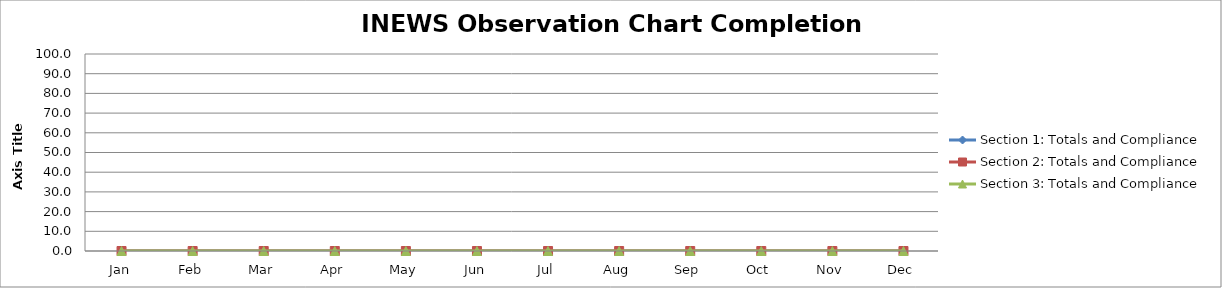
| Category | Section 1: Totals and Compliance | Section 2: Totals and Compliance | Section 3: Totals and Compliance |
|---|---|---|---|
| Jan | 0 | 0 | 0 |
| Feb | 0 | 0 | 0 |
| Mar | 0 | 0 | 0 |
| Apr | 0 | 0 | 0 |
| May | 0 | 0 | 0 |
| Jun | 0 | 0 | 0 |
| Jul | 0 | 0 | 0 |
| Aug | 0 | 0 | 0 |
| Sep | 0 | 0 | 0 |
| Oct | 0 | 0 | 0 |
| Nov | 0 | 0 | 0 |
| Dec | 0 | 0 | 0 |